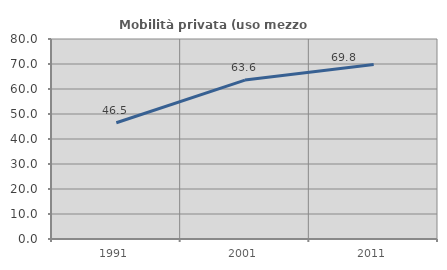
| Category | Mobilità privata (uso mezzo privato) |
|---|---|
| 1991.0 | 46.507 |
| 2001.0 | 63.573 |
| 2011.0 | 69.79 |